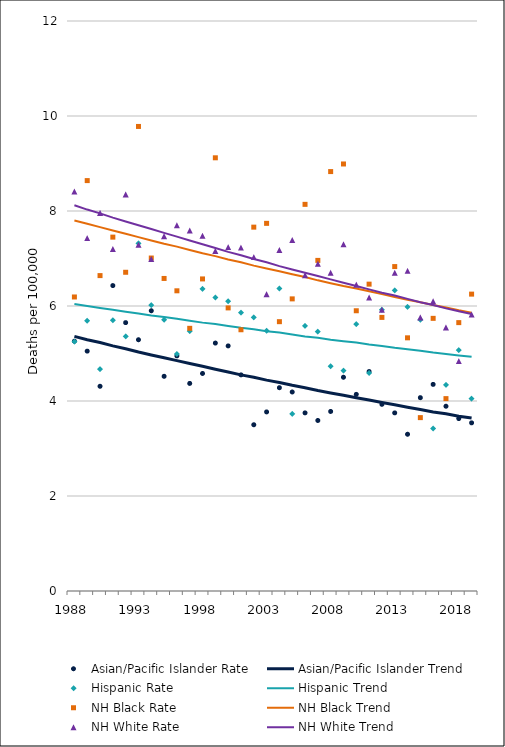
| Category | Asian/Pacific Islander Rate | Asian/Pacific Islander Trend | Hispanic Rate | Hispanic Trend | NH Black Rate | NH Black Trend | NH White Rate | NH White Trend |
|---|---|---|---|---|---|---|---|---|
| 1988.0 | 5.26 | 5.36 | 5.25 | 6.04 | 6.19 | 7.8 | 8.41 | 8.12 |
| 1989.0 | 5.05 | 5.29 | 5.69 | 6 | 8.64 | 7.73 | 7.43 | 8.03 |
| 1990.0 | 4.31 | 5.23 | 4.67 | 5.96 | 6.64 | 7.66 | 7.96 | 7.95 |
| 1991.0 | 6.43 | 5.16 | 5.7 | 5.92 | 7.45 | 7.59 | 7.2 | 7.86 |
| 1992.0 | 5.65 | 5.1 | 5.36 | 5.88 | 6.71 | 7.52 | 8.35 | 7.78 |
| 1993.0 | 5.29 | 5.03 | 7.32 | 5.84 | 9.78 | 7.45 | 7.29 | 7.7 |
| 1994.0 | 5.9 | 4.97 | 6.02 | 5.8 | 7.01 | 7.38 | 6.99 | 7.62 |
| 1995.0 | 4.52 | 4.91 | 5.71 | 5.77 | 6.58 | 7.31 | 7.47 | 7.54 |
| 1996.0 | 4.95 | 4.85 | 4.99 | 5.73 | 6.32 | 7.25 | 7.7 | 7.46 |
| 1997.0 | 4.37 | 4.79 | 5.47 | 5.69 | 5.53 | 7.18 | 7.59 | 7.38 |
| 1998.0 | 4.58 | 4.73 | 6.36 | 5.65 | 6.57 | 7.11 | 7.48 | 7.3 |
| 1999.0 | 5.22 | 4.67 | 6.18 | 5.62 | 9.12 | 7.05 | 7.16 | 7.22 |
| 2000.0 | 5.16 | 4.61 | 6.1 | 5.58 | 5.96 | 6.98 | 7.24 | 7.14 |
| 2001.0 | 4.55 | 4.55 | 5.86 | 5.54 | 5.5 | 6.92 | 7.23 | 7.07 |
| 2002.0 | 3.5 | 4.5 | 5.76 | 5.51 | 7.66 | 6.85 | 7.03 | 6.99 |
| 2003.0 | 3.77 | 4.44 | 5.48 | 5.47 | 7.74 | 6.79 | 6.25 | 6.92 |
| 2004.0 | 4.28 | 4.39 | 6.37 | 5.44 | 5.67 | 6.73 | 7.18 | 6.84 |
| 2005.0 | 4.19 | 4.33 | 3.73 | 5.4 | 6.15 | 6.67 | 7.39 | 6.77 |
| 2006.0 | 3.75 | 4.28 | 5.58 | 5.36 | 8.14 | 6.61 | 6.65 | 6.7 |
| 2007.0 | 3.59 | 4.22 | 5.46 | 5.33 | 6.96 | 6.54 | 6.89 | 6.63 |
| 2008.0 | 3.78 | 4.17 | 4.73 | 5.29 | 8.83 | 6.48 | 6.7 | 6.56 |
| 2009.0 | 4.5 | 4.12 | 4.64 | 5.26 | 8.99 | 6.42 | 7.3 | 6.49 |
| 2010.0 | 4.14 | 4.07 | 5.62 | 5.23 | 5.9 | 6.37 | 6.45 | 6.42 |
| 2011.0 | 4.62 | 4.02 | 4.59 | 5.19 | 6.46 | 6.31 | 6.18 | 6.35 |
| 2012.0 | 3.93 | 3.97 | 5.92 | 5.16 | 5.76 | 6.25 | 5.92 | 6.28 |
| 2013.0 | 3.75 | 3.92 | 6.33 | 5.12 | 6.83 | 6.19 | 6.7 | 6.22 |
| 2014.0 | 3.3 | 3.87 | 5.98 | 5.09 | 5.33 | 6.13 | 6.74 | 6.15 |
| 2015.0 | 4.07 | 3.82 | 5.71 | 5.06 | 3.65 | 6.08 | 5.76 | 6.08 |
| 2016.0 | 4.35 | 3.77 | 3.42 | 5.02 | 5.74 | 6.02 | 6.1 | 6.02 |
| 2017.0 | 3.89 | 3.73 | 4.34 | 4.99 | 4.05 | 5.97 | 5.55 | 5.95 |
| 2018.0 | 3.63 | 3.68 | 5.07 | 4.96 | 5.65 | 5.91 | 4.84 | 5.89 |
| 2019.0 | 3.54 | 3.64 | 4.05 | 4.93 | 6.25 | 5.86 | 5.82 | 5.83 |